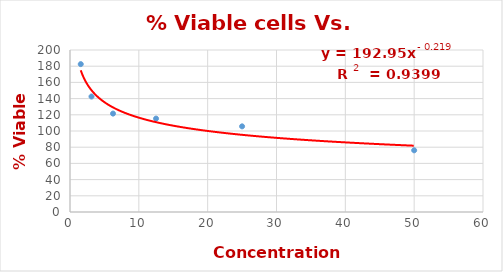
| Category | Series 0 |
|---|---|
| 50.0 | 76.17 |
| 25.0 | 105.745 |
| 12.5 | 115.319 |
| 6.25 | 121.489 |
| 3.125 | 142.553 |
| 1.5625 | 182.553 |